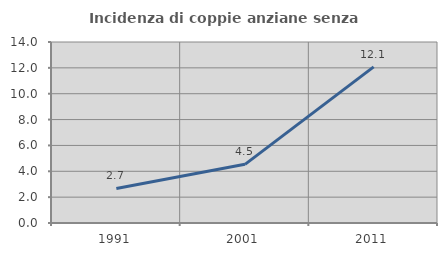
| Category | Incidenza di coppie anziane senza figli  |
|---|---|
| 1991.0 | 2.674 |
| 2001.0 | 4.537 |
| 2011.0 | 12.08 |